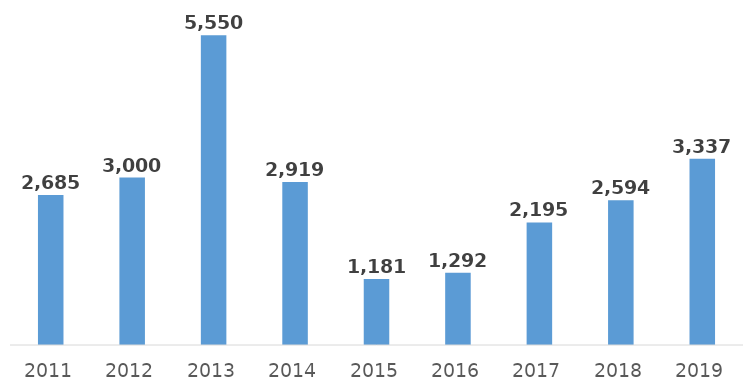
| Category | Interessi passivi sui conti di tesoreria |
|---|---|
| 2011.0 | 2684.787 |
| 2012.0 | 3000 |
| 2013.0 | 5550 |
| 2014.0 | 2919.432 |
| 2015.0 | 1181.156 |
| 2016.0 | 1292.429 |
| 2017.0 | 2194.788 |
| 2018.0 | 2593.733 |
| 2019.0 | 3337.116 |